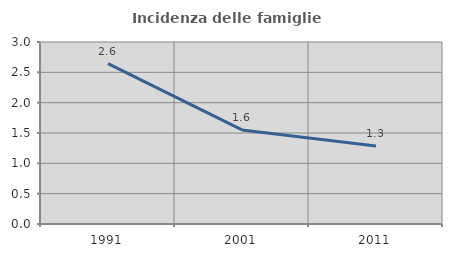
| Category | Incidenza delle famiglie numerose |
|---|---|
| 1991.0 | 2.644 |
| 2001.0 | 1.55 |
| 2011.0 | 1.288 |